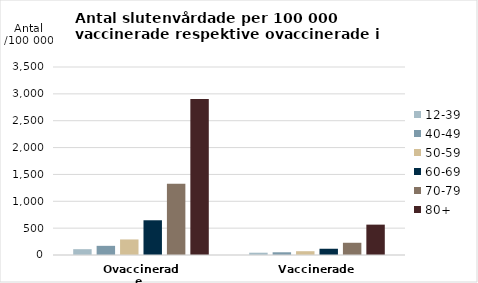
| Category | 12-39 | 40-49 | 50-59 | 60-69 | 70-79 | 80+ |
|---|---|---|---|---|---|---|
| Ovaccinerade  | 108.332 | 170.616 | 289.579 | 646.654 | 1325.384 | 2904.917 |
| Vaccinerade  | 42.819 | 50.698 | 70.662 | 116.255 | 227.826 | 565.355 |